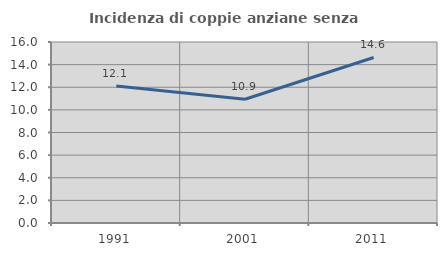
| Category | Incidenza di coppie anziane senza figli  |
|---|---|
| 1991.0 | 12.11 |
| 2001.0 | 10.943 |
| 2011.0 | 14.63 |